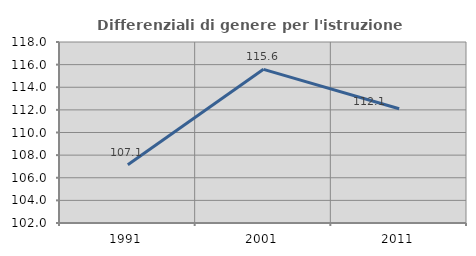
| Category | Differenziali di genere per l'istruzione superiore |
|---|---|
| 1991.0 | 107.148 |
| 2001.0 | 115.584 |
| 2011.0 | 112.098 |